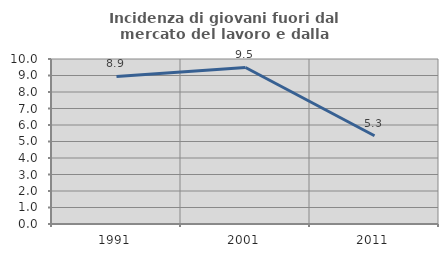
| Category | Incidenza di giovani fuori dal mercato del lavoro e dalla formazione  |
|---|---|
| 1991.0 | 8.943 |
| 2001.0 | 9.486 |
| 2011.0 | 5.348 |